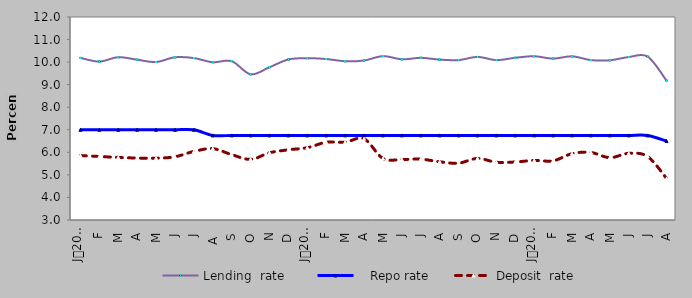
| Category | Lending  rate |    Repo rate | Deposit  rate |
|---|---|---|---|
| 0 | 10.187 | 7 | 5.858 |
| 1900-01-01 | 10.024 | 7 | 5.815 |
| 1900-01-02 | 10.218 | 7 | 5.776 |
| 1900-01-03 | 10.107 | 7 | 5.746 |
| 1900-01-04 | 10.004 | 7 | 5.74 |
| 1900-01-05 | 10.214 | 7 | 5.804 |
| 1900-01-06 | 10.18 | 7 | 6.04 |
| 1900-01-07 | 9.994 | 6.75 | 6.162 |
| 1900-01-08 | 10.042 | 6.75 | 5.898 |
| 1900-01-09 | 9.46 | 6.75 | 5.69 |
| 1900-01-10 | 9.774 | 6.75 | 5.98 |
| 1900-01-11 | 10.117 | 6.75 | 6.113 |
| 1900-01-12 | 10.174 | 6.75 | 6.207 |
| 1900-01-13 | 10.136 | 6.75 | 6.446 |
| 1900-01-14 | 10.04 | 6.75 | 6.45 |
| 1900-01-15 | 10.07 | 6.75 | 6.6 |
| 1900-01-16 | 10.265 | 6.75 | 5.728 |
| 1900-01-17 | 10.125 | 6.75 | 5.682 |
| 1900-01-18 | 10.19 | 6.75 | 5.7 |
| 1900-01-19 | 10.11 | 6.75 | 5.58 |
| 1900-01-20 | 10.09 | 6.75 | 5.52 |
| 1900-01-21 | 10.23 | 6.75 | 5.73 |
| 1900-01-22 | 10.09 | 6.75 | 5.56 |
| 1900-01-23 | 10.192 | 6.75 | 5.572 |
| 1900-01-24 | 10.261 | 6.75 | 5.643 |
| 1900-01-25 | 10.155 | 6.75 | 5.624 |
| 1900-01-26 | 10.257 | 6.75 | 5.943 |
| 1900-01-27 | 10.09 | 6.75 | 5.994 |
| 1900-01-28 | 10.081 | 6.75 | 5.764 |
| 1900-01-29 | 10.224 | 6.75 | 5.956 |
| 1900-01-30 | 10.245 | 6.75 | 5.813 |
| 1900-01-31 | 9.178 | 6.5 | 4.843 |